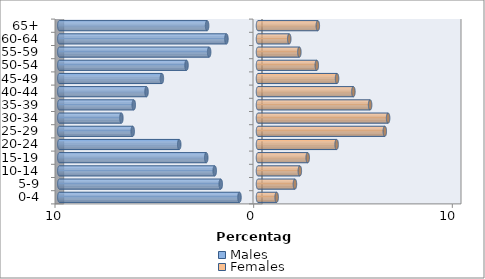
| Category | Males | Females |
|---|---|---|
| 0-4 | -0.932 | 0.94 |
| 5-9 | -1.876 | 1.859 |
| 10-14 | -2.179 | 2.106 |
| 15-19 | -2.605 | 2.502 |
| 20-24 | -3.965 | 3.958 |
| 25-29 | -6.307 | 6.383 |
| 30-34 | -6.877 | 6.55 |
| 35-39 | -6.253 | 5.643 |
| 40-44 | -5.611 | 4.802 |
| 45-49 | -4.838 | 3.978 |
| 50-54 | -3.598 | 2.96 |
| 55-59 | -2.459 | 2.082 |
| 60-64 | -1.589 | 1.573 |
| 65+ | -2.562 | 3.012 |